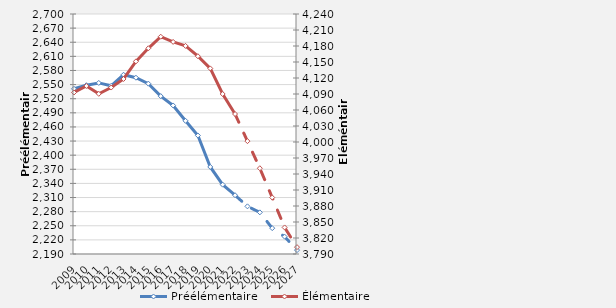
| Category | Préélémentaire |
|---|---|
| 2009.0 | 2541.04 |
| 2010.0 | 2548.715 |
| 2011.0 | 2553.567 |
| 2012.0 | 2547.414 |
| 2013.0 | 2570.9 |
| 2014.0 | 2564.606 |
| 2015.0 | 2552.014 |
| 2016.0 | 2525.465 |
| 2017.0 | 2505.653 |
| 2018.0 | 2473.058 |
| 2019.0 | 2441.82 |
| 2020.0 | 2374.98 |
| 2021.0 | 2337.371 |
| 2022.0 | 2314.893 |
| 2023.0 | 2291.261 |
| 2024.0 | 2278.478 |
| 2025.0 | 2244.892 |
| 2026.0 | 2226.893 |
| 2027.0 | 2198.284 |